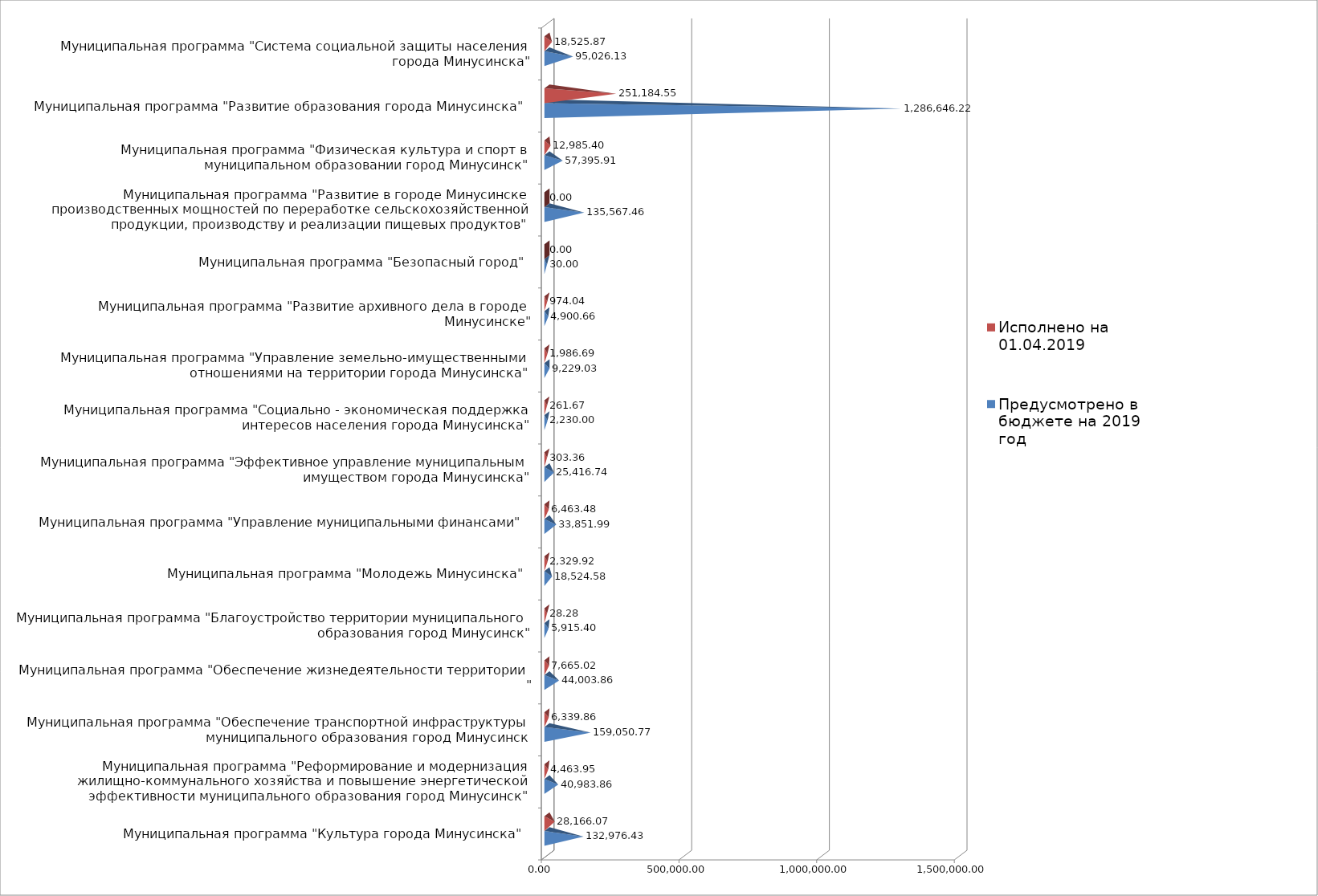
| Category | Предусмотрено в бюджете на 2019 год | Исполнено на 01.04.2019 |
|---|---|---|
| Муниципальная программа "Культура города Минусинска" | 132976.43 | 28166.07 |
| Муниципальная программа "Реформирование и модернизация жилищно-коммунального хозяйства и повышение энергетической эффективности муниципального образования город Минусинск" | 40983.864 | 4463.95 |
| Муниципальная программа "Обеспечение транспортной инфраструктуры муниципального образования город Минусинск | 159050.768 | 6339.86 |
| Муниципальная программа "Обеспечение жизнедеятельности территории " | 44003.86 | 7665.02 |
| Муниципальная программа "Благоустройство территории муниципального образования город Минусинск" | 5915.4 | 28.28 |
| Муниципальная программа "Молодежь Минусинска" | 18524.58 | 2329.92 |
| Муниципальная программа "Управление муниципальными финансами" | 33851.99 | 6463.48 |
| Муниципальная программа "Эффективное управление муниципальным имуществом города Минусинска" | 25416.744 | 303.36 |
| Муниципальная программа "Социально - экономическая поддержка интересов населения города Минусинска" | 2230 | 261.67 |
| Муниципальная программа "Управление земельно-имущественными отношениями на территории города Минусинска" | 9229.03 | 1986.69 |
| Муниципальная программа "Развитие архивного дела в городе Минусинске" | 4900.66 | 974.04 |
| Муниципальная программа "Безопасный город" | 30 | 0 |
| Муниципальная программа "Развитие в городе Минусинске производственных мощностей по переработке сельскохозяйственной продукции, производству и реализации пищевых продуктов" | 135567.46 | 0 |
| Муниципальная программа "Физическая культура и спорт в муниципальном образовании город Минусинск" | 57395.91 | 12985.4 |
| Муниципальная программа "Развитие образования города Минусинска" | 1286646.22 | 251184.55 |
| Муниципальная программа "Система социальной защиты населения города Минусинска" | 95026.13 | 18525.87 |